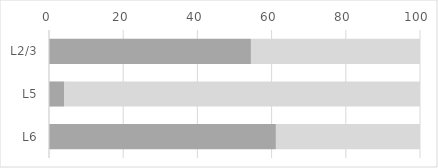
| Category | Series 0 | Series 1 |
|---|---|---|
| L2/3 | 54.431 | 45.569 |
| L5 | 4.144 | 95.856 |
| L6 | 61.161 | 38.839 |